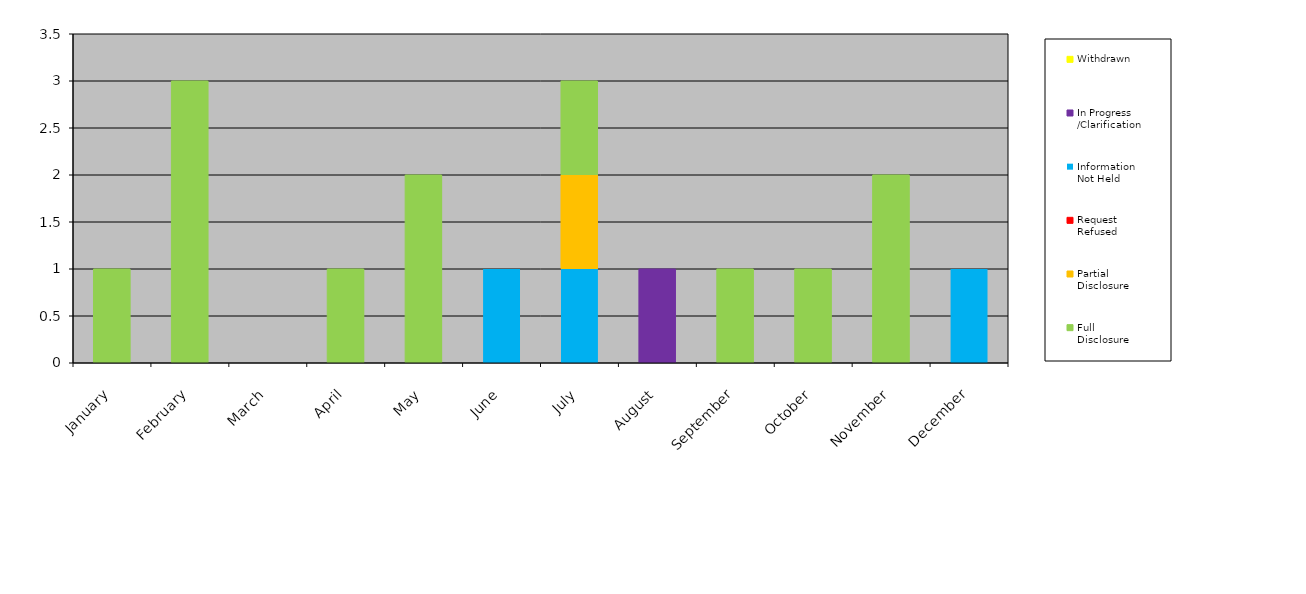
| Category | Withdrawn | In Progress
/Clarification | Information
Not Held | Request
Refused | Partial
Disclosure | Full
Disclosure |
|---|---|---|---|---|---|---|
| January | 0 | 0 | 0 | 0 | 0 | 1 |
| February | 0 | 0 | 0 | 0 | 0 | 3 |
| March | 0 | 0 | 0 | 0 | 0 | 0 |
| April | 0 | 0 | 0 | 0 | 0 | 1 |
| May | 0 | 0 | 0 | 0 | 0 | 2 |
| June | 0 | 0 | 1 | 0 | 0 | 0 |
| July | 0 | 0 | 1 | 0 | 1 | 1 |
| August | 0 | 1 | 0 | 0 | 0 | 0 |
| September | 0 | 0 | 0 | 0 | 0 | 1 |
| October | 0 | 0 | 0 | 0 | 0 | 1 |
| November | 0 | 0 | 0 | 0 | 0 | 2 |
| December | 0 | 0 | 1 | 0 | 0 | 0 |